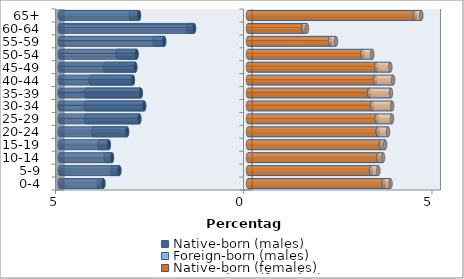
| Category | Native-born (males) | Foreign-born (males) | Native-born (females) | Foreign-born (females) |
|---|---|---|---|---|
| 0-4 | -3.842 | -0.116 | 3.605 | 0.18 |
| 5-9 | -3.419 | -0.177 | 3.267 | 0.195 |
| 10-14 | -3.614 | -0.165 | 3.459 | 0.128 |
| 15-19 | -3.698 | -0.245 | 3.527 | 0.115 |
| 20-24 | -3.213 | -0.897 | 3.445 | 0.275 |
| 25-29 | -2.888 | -1.42 | 3.413 | 0.411 |
| 30-34 | -2.76 | -1.545 | 3.294 | 0.535 |
| 35-39 | -2.849 | -1.449 | 3.222 | 0.575 |
| 40-44 | -3.058 | -1.129 | 3.376 | 0.477 |
| 45-49 | -2.994 | -0.801 | 3.41 | 0.369 |
| 50-54 | -2.962 | -0.502 | 3.034 | 0.267 |
| 55-59 | -2.228 | -0.255 | 2.18 | 0.156 |
| 60-64 | -1.435 | -0.144 | 1.47 | 0.096 |
| 65+ | -2.896 | -0.214 | 4.432 | 0.171 |